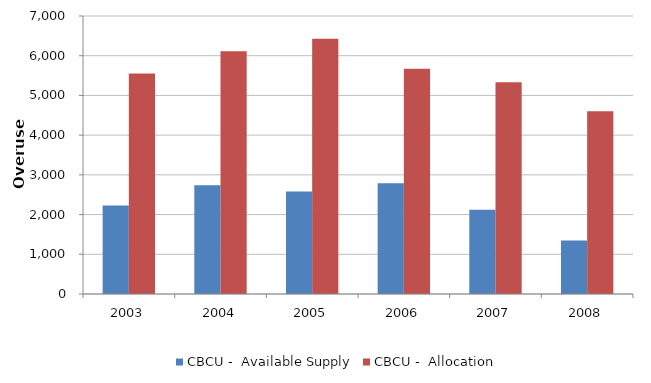
| Category | CBCU -  Available Supply | CBCU -  Allocation |
|---|---|---|
| 2003.0 | 2230 | 5550 |
| 2004.0 | 2740 | 6110 |
| 2005.0 | 2580 | 6430 |
| 2006.0 | 2790 | 5670 |
| 2007.0 | 2120 | 5330 |
| 2008.0 | 1350 | 4600 |